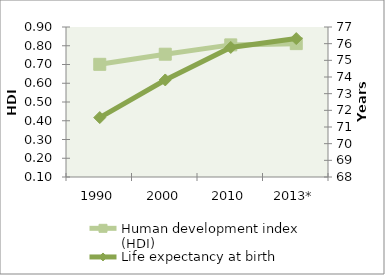
| Category | Human development index (HDI) |
|---|---|
| 1990 | 0.701 |
| 2000 | 0.755 |
| 2010 | 0.805 |
| 2013* | 0.811 |